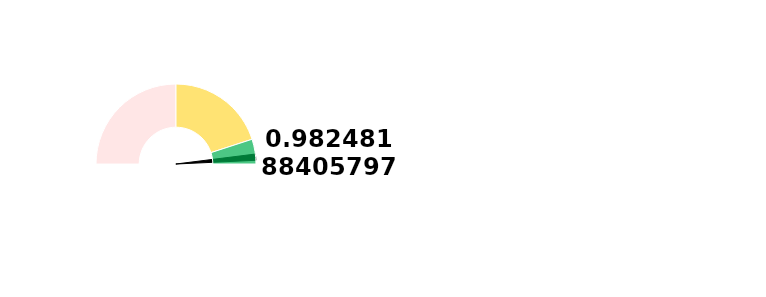
| Category | Ponteiro |
|---|---|
| 0 | 98.248 |
| 1 | 2.5 |
| 2 | 99.252 |